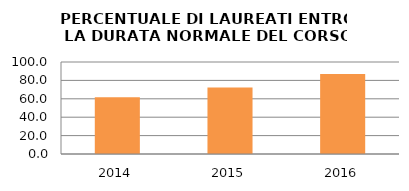
| Category | 2014 2015 2016 |
|---|---|
| 2014.0 | 61.667 |
| 2015.0 | 72.222 |
| 2016.0 | 87.037 |